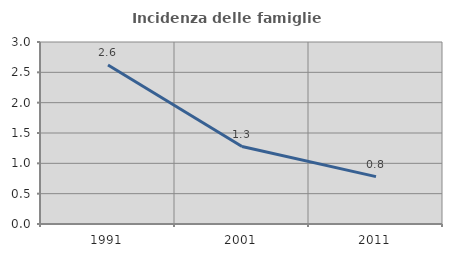
| Category | Incidenza delle famiglie numerose |
|---|---|
| 1991.0 | 2.62 |
| 2001.0 | 1.277 |
| 2011.0 | 0.781 |